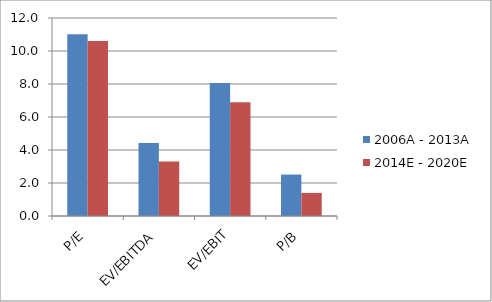
| Category | 2006A - 2013A | 2014E - 2020E |
|---|---|---|
| P/E | 11.01 | 10.6 |
| EV/EBITDA | 4.422 | 3.3 |
| EV/EBIT | 8.068 | 6.9 |
| P/B | 2.512 | 1.4 |